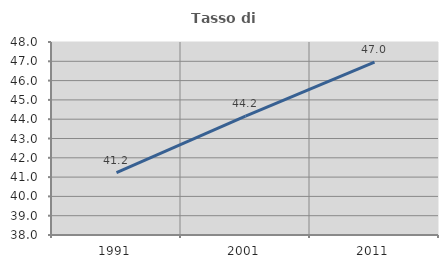
| Category | Tasso di occupazione   |
|---|---|
| 1991.0 | 41.237 |
| 2001.0 | 44.157 |
| 2011.0 | 46.963 |